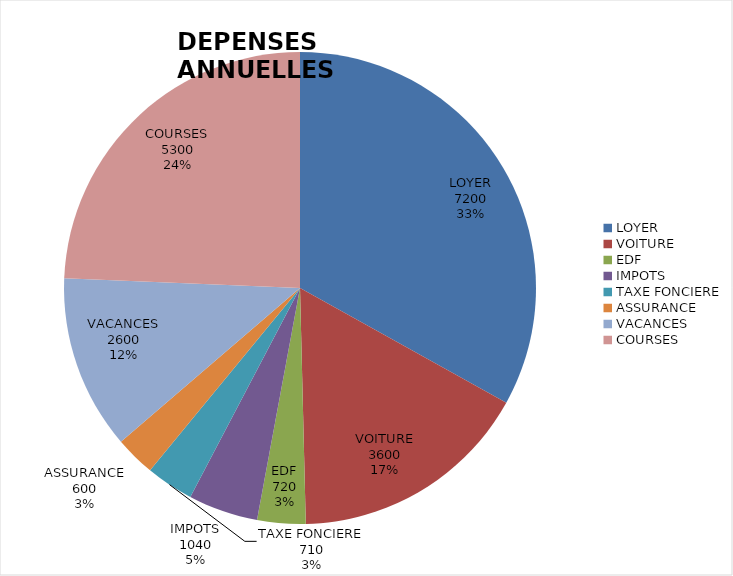
| Category | Series 0 |
|---|---|
| LOYER | 7200 |
| VOITURE | 3600 |
| EDF | 720 |
| IMPOTS | 1040 |
| TAXE FONCIERE | 710 |
| ASSURANCE | 600 |
| VACANCES | 2600 |
| COURSES | 5300 |